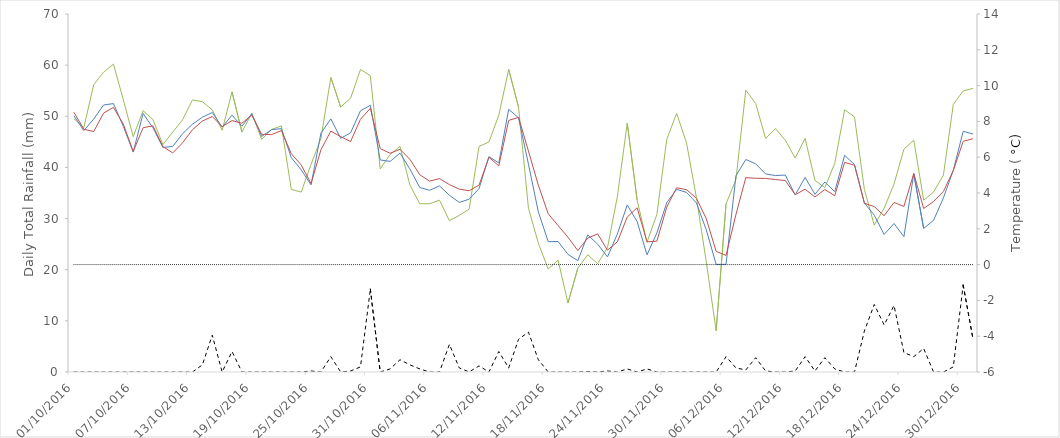
| Category | Daily Total Rainfall (mm) |
|---|---|
| 01/10/2016 | 0 |
| 02/10/2016 | 0 |
| 03/10/2016 | 0 |
| 04/10/2016 | 0 |
| 05/10/2016 | 0 |
| 06/10/2016 | 0 |
| 07/10/2016 | 0 |
| 08/10/2016 | 0 |
| 09/10/2016 | 0 |
| 10/10/2016 | 0 |
| 11/10/2016 | 0 |
| 12/10/2016 | 0 |
| 13/10/2016 | 0 |
| 14/10/2016 | 1.4 |
| 15/10/2016 | 7.2 |
| 16/10/2016 | 0 |
| 17/10/2016 | 4 |
| 18/10/2016 | 0 |
| 19/10/2016 | 0 |
| 20/10/2016 | 0 |
| 21/10/2016 | 0 |
| 22/10/2016 | 0 |
| 23/10/2016 | 0 |
| 24/10/2016 | 0 |
| 25/10/2016 | 0.2 |
| 26/10/2016 | 0 |
| 27/10/2016 | 3 |
| 28/10/2016 | 0 |
| 29/10/2016 | 0.2 |
| 30/10/2016 | 1 |
| 31/10/2016 | 16.2 |
| 01/11/2016 | 0 |
| 02/11/2016 | 0.6 |
| 03/11/2016 | 2.4 |
| 04/11/2016 | 1.4 |
| 05/11/2016 | 0.6 |
| 06/11/2016 | 0 |
| 07/11/2016 | 0 |
| 08/11/2016 | 5.4 |
| 09/11/2016 | 0.8 |
| 10/11/2016 | 0 |
| 11/11/2016 | 1.2 |
| 12/11/2016 | 0 |
| 13/11/2016 | 4 |
| 14/11/2016 | 0.8 |
| 15/11/2016 | 6.4 |
| 16/11/2016 | 7.8 |
| 17/11/2016 | 2.4 |
| 18/11/2016 | 0 |
| 19/11/2016 | 0 |
| 20/11/2016 | 0 |
| 21/11/2016 | 0 |
| 22/11/2016 | 0.1 |
| 23/11/2016 | 0 |
| 24/11/2016 | 0.2 |
| 25/11/2016 | 0 |
| 26/11/2016 | 0.6 |
| 27/11/2016 | 0 |
| 28/11/2016 | 0.6 |
| 29/11/2016 | 0 |
| 30/11/2016 | 0 |
| 01/12/2016 | 0 |
| 02/12/2016 | 0 |
| 03/12/2016 | 0 |
| 04/12/2016 | 0 |
| 05/12/2016 | 0 |
| 06/12/2016 | 3 |
| 07/12/2016 | 0.8 |
| 08/12/2016 | 0.4 |
| 09/12/2016 | 2.8 |
| 10/12/2016 | 0.2 |
| 11/12/2016 | 0 |
| 12/12/2016 | 0 |
| 13/12/2016 | 0.2 |
| 14/12/2016 | 3 |
| 15/12/2016 | 0.2 |
| 16/12/2016 | 2.8 |
| 17/12/2016 | 0.6 |
| 18/12/2016 | 0 |
| 19/12/2016 | 0 |
| 20/12/2016 | 8 |
| 21/12/2016 | 13.2 |
| 22/12/2016 | 9.2 |
| 23/12/2016 | 13 |
| 24/12/2016 | 3.8 |
| 25/12/2016 | 3 |
| 26/12/2016 | 4.6 |
| 27/12/2016 | 0 |
| 28/12/2016 | 0 |
| 29/12/2016 | 1 |
| 30/12/2016 | 17 |
| 31/12/2016 | 6.4 |